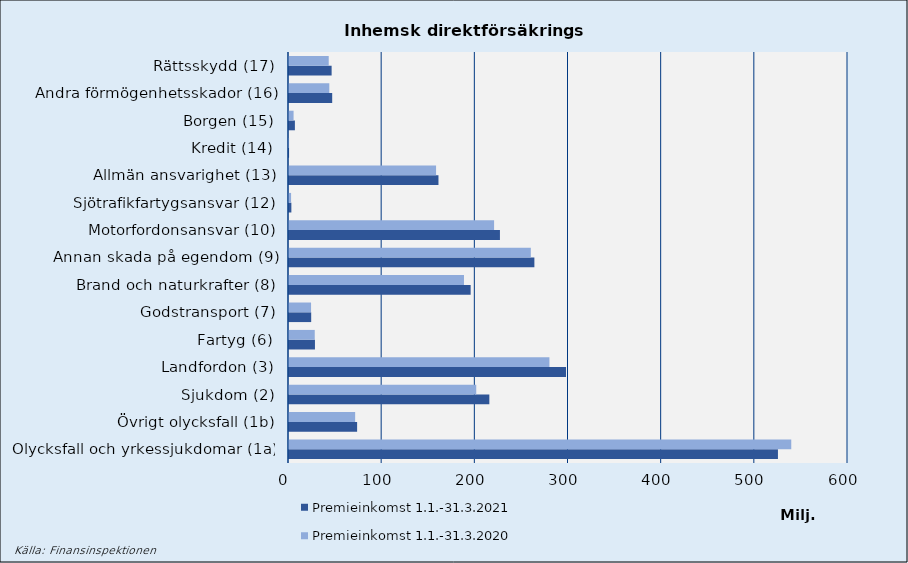
| Category | Premieinkomst |
|---|---|
| Olycksfall och yrkessjukdomar (1a) | 539099.829 |
| Övrigt olycksfall (1b) | 71004.602 |
| Sjukdom (2) | 200977.604 |
| Landfordon (3) | 279528.731 |
| Fartyg (6) | 27637.843 |
| Godstransport (7) | 23677.666 |
| Brand och naturkrafter (8) | 187810.752 |
| Annan skada på egendom (9) | 259566.201 |
| Motorfordonsansvar (10) | 220128.823 |
| Sjötrafikfartygsansvar (12) | 2238.774 |
| Allmän ansvarighet (13) | 157852.114 |
| Kredit (14) | 71.168 |
| Borgen (15) | 4914.492 |
| Andra förmögenhetsskador (16) | 43265.784 |
| Rättsskydd (17) | 42633.127 |